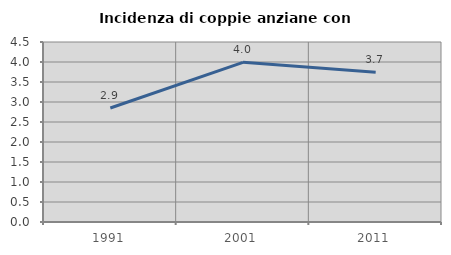
| Category | Incidenza di coppie anziane con figli |
|---|---|
| 1991.0 | 2.85 |
| 2001.0 | 3.992 |
| 2011.0 | 3.743 |